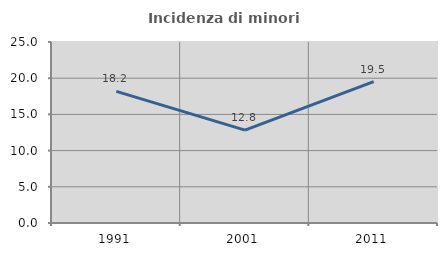
| Category | Incidenza di minori stranieri |
|---|---|
| 1991.0 | 18.182 |
| 2001.0 | 12.821 |
| 2011.0 | 19.54 |